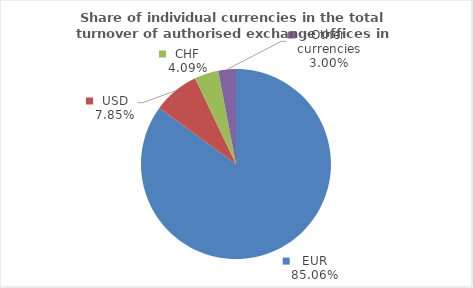
| Category | Series 0 |
|---|---|
| EUR | 85.056 |
| USD | 7.851 |
| CHF | 4.091 |
| Other currencies | 3.003 |